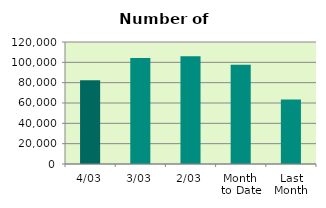
| Category | Series 0 |
|---|---|
| 4/03 | 82366 |
| 3/03 | 104356 |
| 2/03 | 106084 |
| Month 
to Date | 97602 |
| Last
Month | 63353.4 |